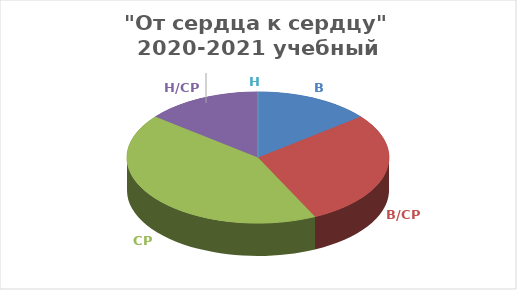
| Category | декабрь | май |
|---|---|---|
| В | 1 | 2 |
| В/СР | 2 | 3 |
| СР | 3 | 2 |
| Н/СР | 1 | 0 |
| Н | 0 | 0 |